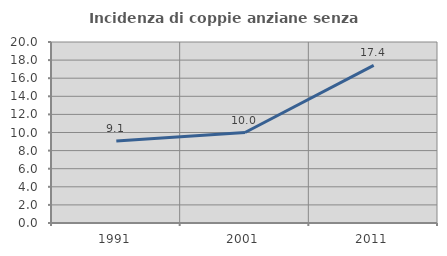
| Category | Incidenza di coppie anziane senza figli  |
|---|---|
| 1991.0 | 9.053 |
| 2001.0 | 10 |
| 2011.0 | 17.409 |